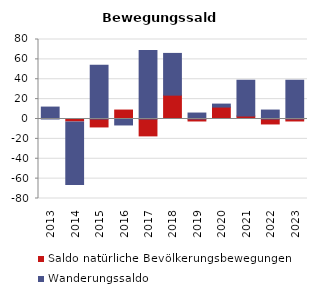
| Category | Saldo natürliche Bevölkerungsbewegungen | Wanderungssaldo |
|---|---|---|
| 2013.0 | 0 | 12 |
| 2014.0 | -3 | -63 |
| 2015.0 | -9 | 54 |
| 2016.0 | 9 | -6 |
| 2017.0 | -18 | 69 |
| 2018.0 | 24 | 42 |
| 2019.0 | -3 | 6 |
| 2020.0 | 12 | 3 |
| 2021.0 | 3 | 36 |
| 2022.0 | -6 | 9 |
| 2023.0 | -3 | 39 |